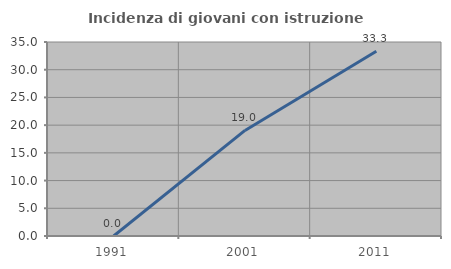
| Category | Incidenza di giovani con istruzione universitaria |
|---|---|
| 1991.0 | 0 |
| 2001.0 | 19.048 |
| 2011.0 | 33.333 |